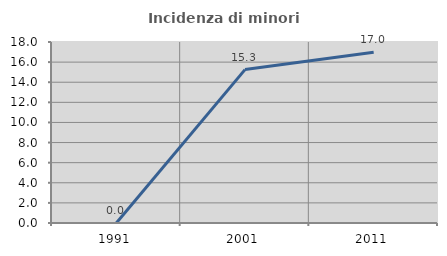
| Category | Incidenza di minori stranieri |
|---|---|
| 1991.0 | 0 |
| 2001.0 | 15.254 |
| 2011.0 | 16.97 |